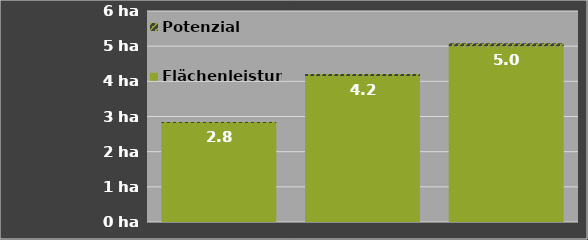
| Category | Flächenleistung 
mit An-/Abfahrt | Potenzial |
|---|---|---|
| 0 | 2.817 | 0.027 |
| 1 | 4.15 | 0.058 |
| 2 | 5 | 0.085 |